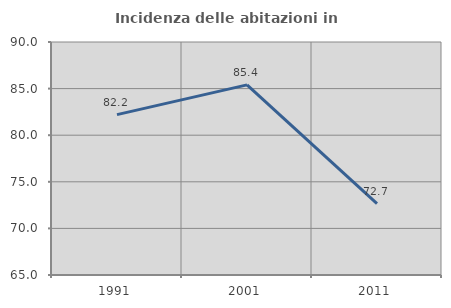
| Category | Incidenza delle abitazioni in proprietà  |
|---|---|
| 1991.0 | 82.212 |
| 2001.0 | 85.401 |
| 2011.0 | 72.664 |